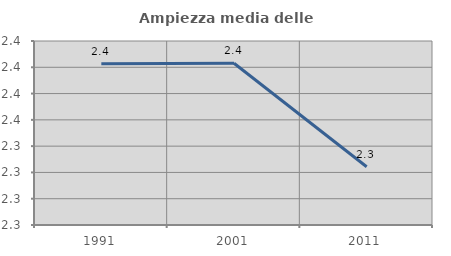
| Category | Ampiezza media delle famiglie |
|---|---|
| 1991.0 | 2.403 |
| 2001.0 | 2.403 |
| 2011.0 | 2.324 |